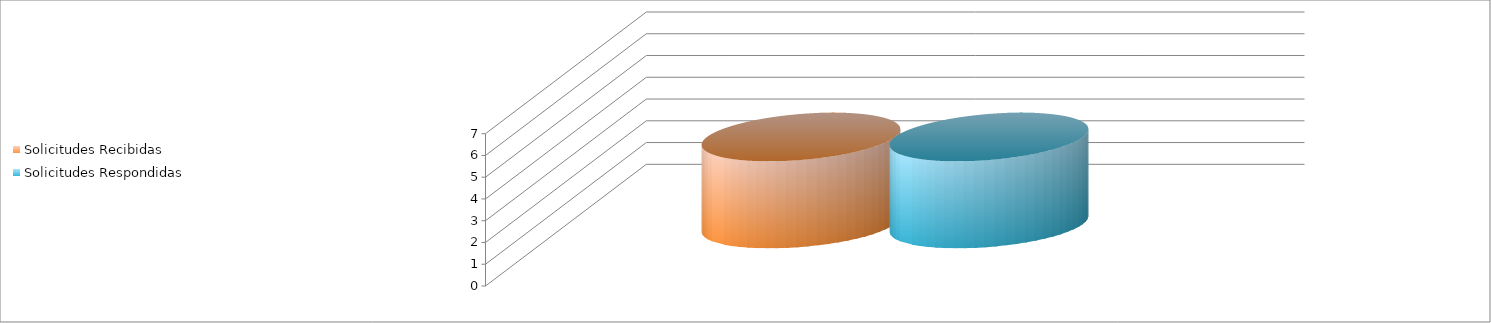
| Category | Solicitudes Recibidas | Solicitudes Respondidas |
|---|---|---|
| 1.0 | 4 | 4 |